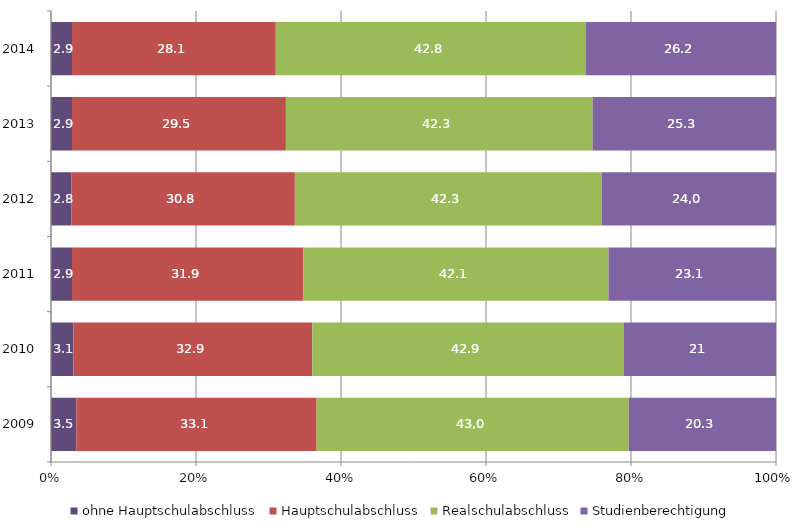
| Category | ohne Hauptschulabschluss | Hauptschulabschluss | Realschulabschluss | Studienberechtigung |
|---|---|---|---|---|
| 2009.0 | 3.5 | 33.1 | 43 | 20.3 |
| 2010.0 | 3.1 | 32.9 | 42.9 | 21 |
| 2011.0 | 2.9 | 31.9 | 42.1 | 23.1 |
| 2012.0 | 2.8 | 30.8 | 42.3 | 24 |
| 2013.0 | 2.9 | 29.5 | 42.3 | 25.3 |
| 2014.0 | 2.9 | 28.1 | 42.8 | 26.2 |